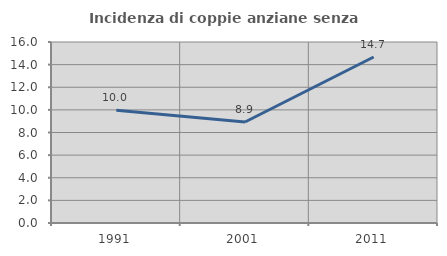
| Category | Incidenza di coppie anziane senza figli  |
|---|---|
| 1991.0 | 9.963 |
| 2001.0 | 8.929 |
| 2011.0 | 14.676 |